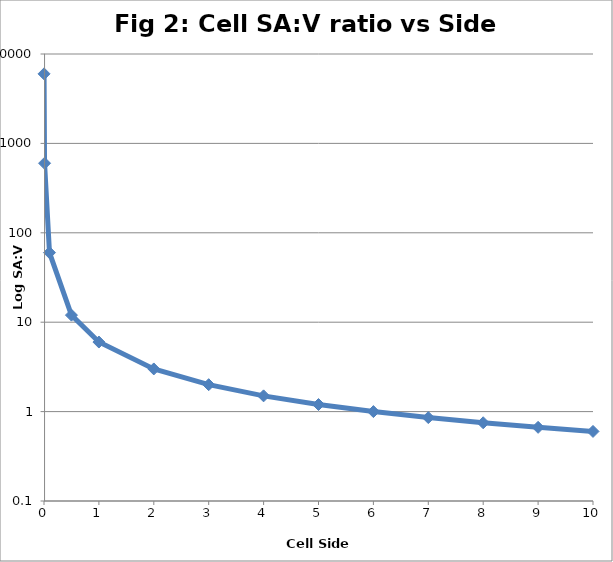
| Category | Series 0 |
|---|---|
| 0.001 | 6000 |
| 0.01 | 600 |
| 0.1 | 60 |
| 0.5 | 12 |
| 1.0 | 6 |
| 2.0 | 3 |
| 3.0 | 2 |
| 4.0 | 1.5 |
| 5.0 | 1.2 |
| 6.0 | 1 |
| 7.0 | 0.857 |
| 8.0 | 0.75 |
| 9.0 | 0.667 |
| 10.0 | 0.6 |